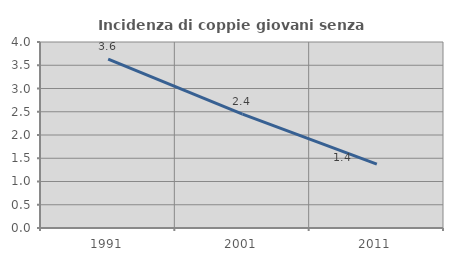
| Category | Incidenza di coppie giovani senza figli |
|---|---|
| 1991.0 | 3.632 |
| 2001.0 | 2.449 |
| 2011.0 | 1.372 |